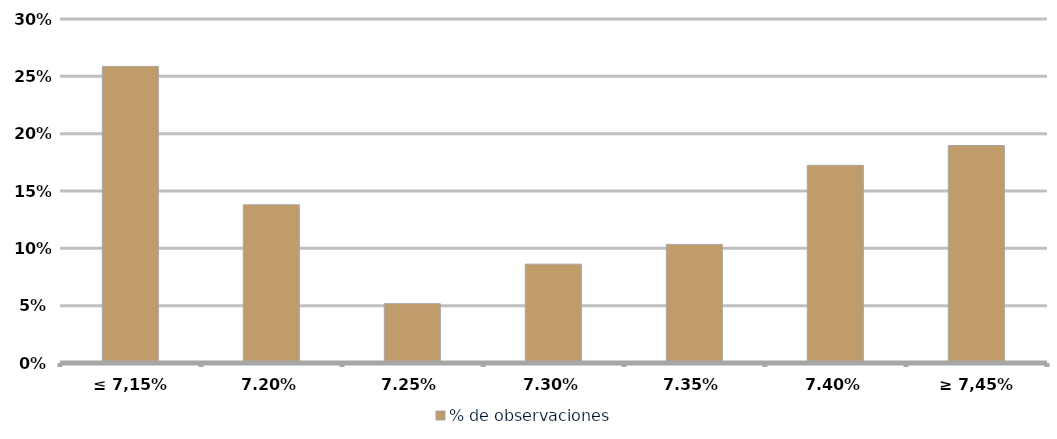
| Category | % de observaciones  |
|---|---|
| ≤ 7,15% | 0.259 |
| 7,20% | 0.138 |
| 7,25% | 0.052 |
| 7,30% | 0.086 |
| 7,35% | 0.103 |
| 7,40% | 0.172 |
| ≥ 7,45% | 0.19 |